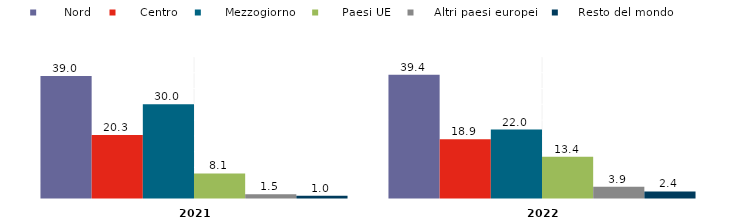
| Category |       Nord |      Centro |      Mezzogiorno |      Paesi UE |     Altri paesi europei |     Resto del mondo |
|---|---|---|---|---|---|---|
| 2021.0 | 39 | 20.3 | 30 | 8.1 | 1.5 | 1 |
| 2022.0 | 39.4 | 18.9 | 22 | 13.4 | 3.9 | 2.4 |